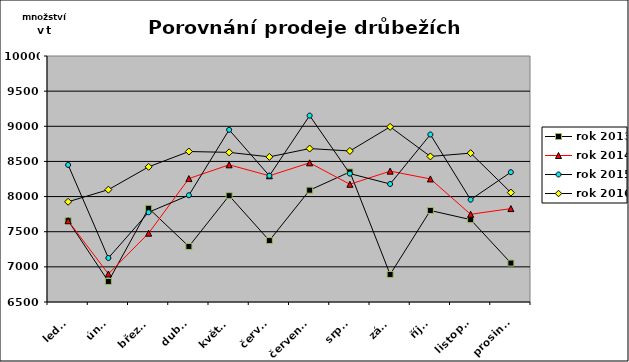
| Category | rok 2013 | rok 2014 | rok 2015 | rok 2016 |
|---|---|---|---|---|
| leden | 7657 | 7656 | 8450 | 7926 |
| únor | 6792 | 6899 | 7126 | 8098 |
| březen | 7833 | 7479 | 7777 | 8423 |
| duben | 7290 | 8256 | 8019 | 8641 |
| květen | 8013 | 8452 | 8950 | 8629 |
| červen | 7374 | 8296 | 8296 | 8565 |
| červenec | 8091 | 8480 | 9152 | 8683 |
| srpen | 8351 | 8175 | 8327 | 8649 |
| září | 6892 | 8362 | 8179 | 8992 |
| říjen | 7802 | 8251 | 8883 | 8571 |
| listopad | 7672 | 7748 | 7956 | 8618 |
| prosinec | 7054 | 7829 | 8347 | 8057 |